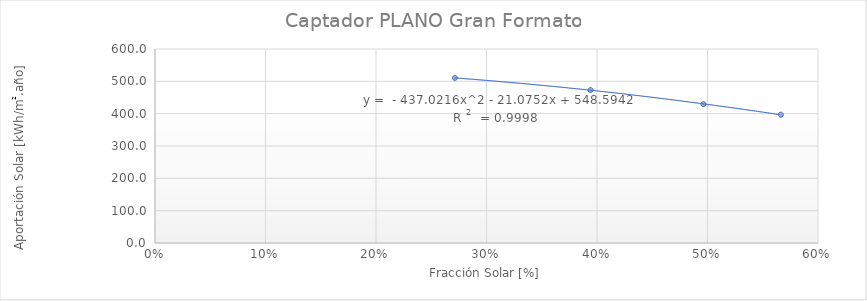
| Category | Captador PLANO Gran Formato |
|---|---|
| 0.271442482422989 | 510.494 |
| 0.39411870272092187 | 473.081 |
| 0.4963050081212301 | 429.582 |
| 0.5663516516208909 | 396.892 |